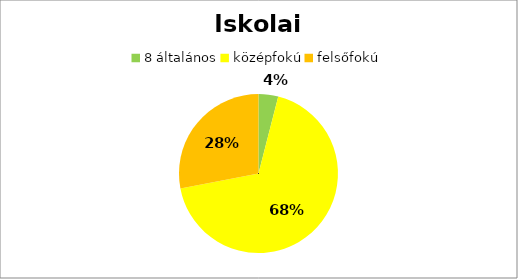
| Category | Series 0 |
|---|---|
| 8 általános | 1 |
| középfokú | 17 |
| felsőfokú | 7 |